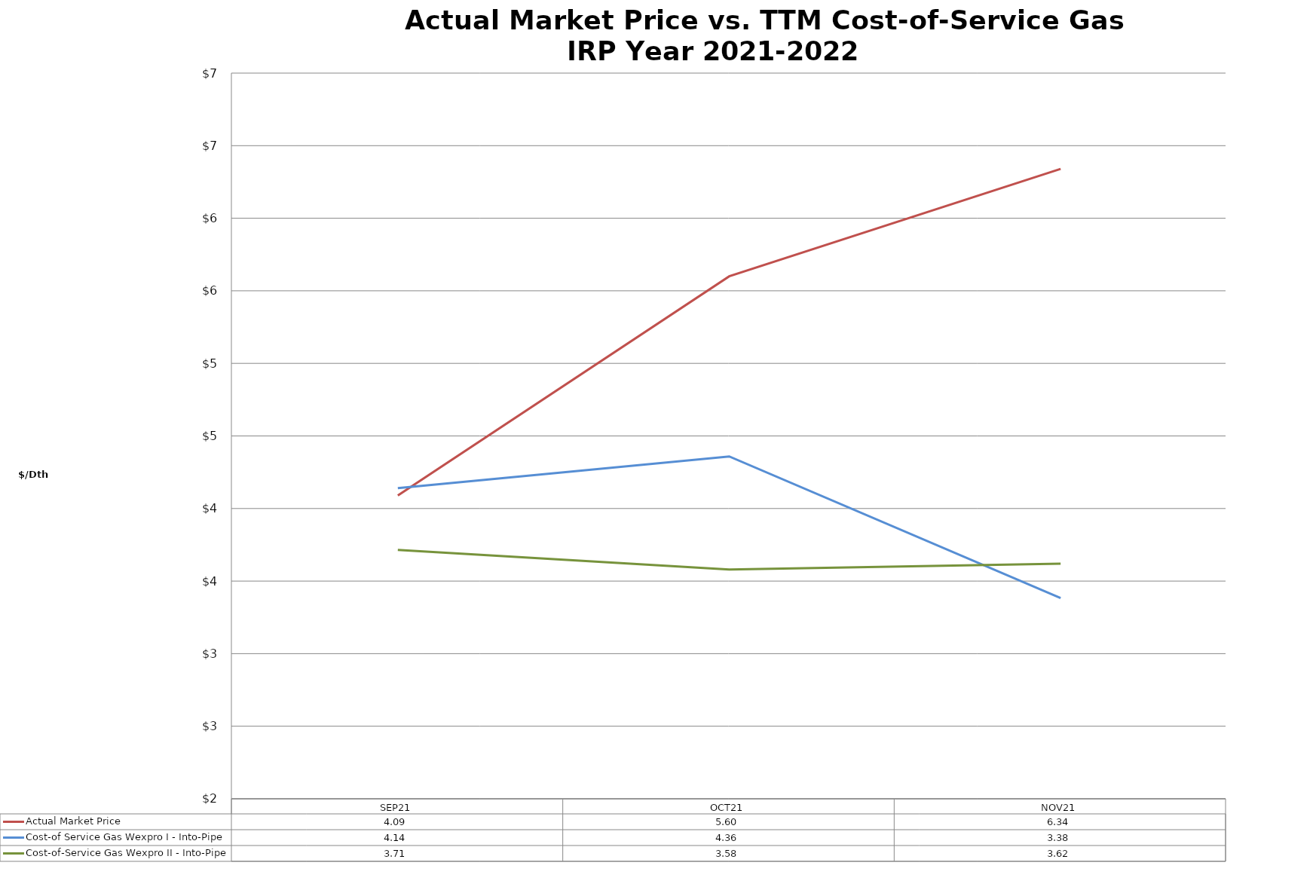
| Category | Actual Market Price | Cost-of Service Gas Wexpro I - Into-Pipe | Cost-of-Service Gas Wexpro II - Into-Pipe |
|---|---|---|---|
| SEP21 | 4.09 | 4.141 | 3.715 |
| OCT21 | 5.6 | 4.359 | 3.58 |
| NOV21 | 6.34 | 3.383 | 3.62 |